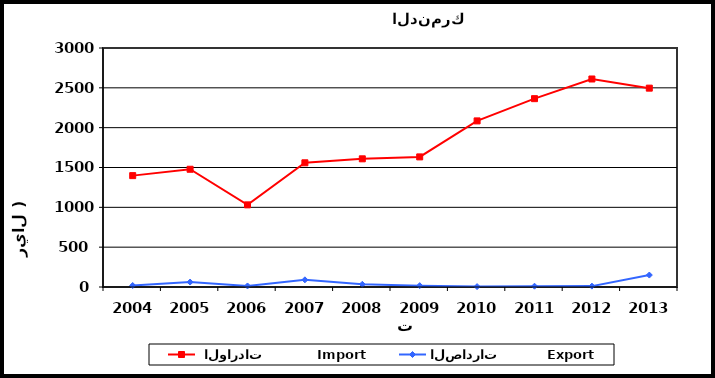
| Category |  الواردات           Import | الصادرات          Export |
|---|---|---|
| 2004.0 | 1398 | 19 |
| 2005.0 | 1478 | 62 |
| 2006.0 | 1031 | 13 |
| 2007.0 | 1559 | 90 |
| 2008.0 | 1609 | 34 |
| 2009.0 | 1633 | 17 |
| 2010.0 | 2085 | 5 |
| 2011.0 | 2364 | 10 |
| 2012.0 | 2611 | 11 |
| 2013.0 | 2496 | 150 |